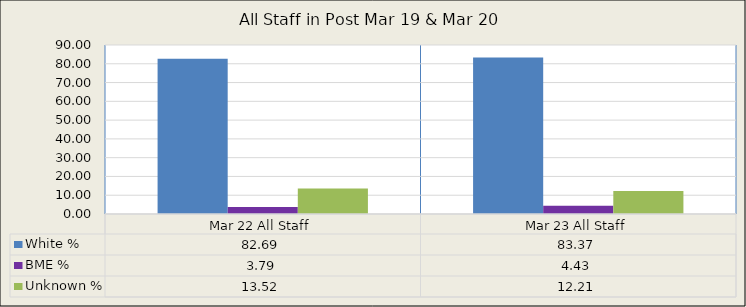
| Category | White % | BME % | Unknown % |
|---|---|---|---|
| Mar 22 All Staff | 82.688 | 3.788 | 13.525 |
| Mar 23 All Staff | 83.367 | 4.426 | 12.206 |